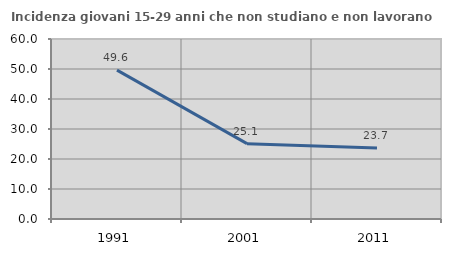
| Category | Incidenza giovani 15-29 anni che non studiano e non lavorano  |
|---|---|
| 1991.0 | 49.64 |
| 2001.0 | 25.108 |
| 2011.0 | 23.673 |